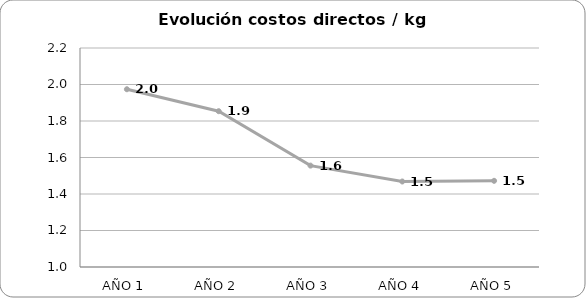
| Category | Evolución costos directos / kg producido |
|---|---|
| AÑO 1 | 1.974 |
| AÑO 2 | 1.854 |
| AÑO 3 | 1.556 |
| AÑO 4 | 1.468 |
| AÑO 5 | 1.472 |